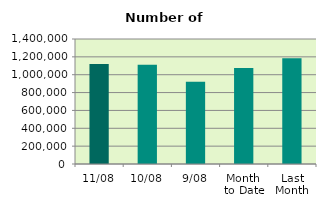
| Category | Series 0 |
|---|---|
| 11/08 | 1119364 |
| 10/08 | 1111262 |
| 9/08 | 921896 |
| Month 
to Date | 1076054.667 |
| Last
Month | 1183989.81 |